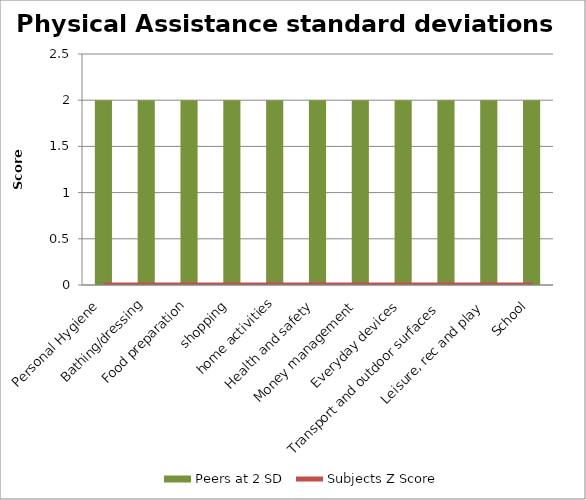
| Category | Peers at 2 SD |
|---|---|
| Personal Hygiene | 2 |
| Bathing/dressing | 2 |
| Food preparation | 2 |
| shopping | 2 |
| home activities | 2 |
| Health and safety | 2 |
| Money management | 2 |
| Everyday devices | 2 |
| Transport and outdoor surfaces | 2 |
| Leisure, rec and play | 2 |
| School | 2 |